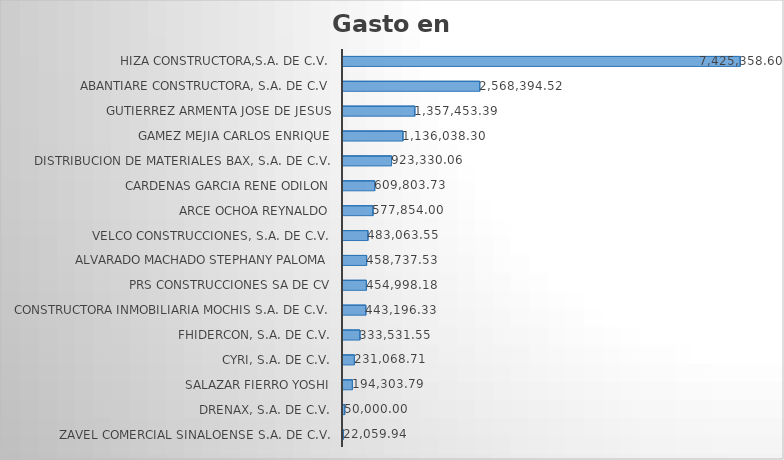
| Category | Suma |
|---|---|
| ZAVEL COMERCIAL SINALOENSE S.A. DE C.V. | 22059.94 |
| DRENAX, S.A. DE C.V. | 50000 |
| SALAZAR FIERRO YOSHI | 194303.79 |
| CYRI, S.A. DE C.V. | 231068.71 |
| FHIDERCON, S.A. DE C.V. | 333531.55 |
| CONSTRUCTORA INMOBILIARIA MOCHIS S.A. DE C.V. | 443196.33 |
| PRS CONSTRUCCIONES SA DE CV | 454998.18 |
| ALVARADO MACHADO STEPHANY PALOMA | 458737.53 |
| VELCO CONSTRUCCIONES, S.A. DE C.V. | 483063.55 |
| ARCE OCHOA REYNALDO | 577854 |
| CARDENAS GARCIA RENE ODILON | 609803.73 |
| DISTRIBUCION DE MATERIALES BAX, S.A. DE C.V. | 923330.06 |
| GAMEZ MEJIA CARLOS ENRIQUE | 1136038.3 |
| GUTIERREZ ARMENTA JOSE DE JESUS | 1357453.39 |
| ABANTIARE CONSTRUCTORA, S.A. DE C.V | 2568394.52 |
| HIZA CONSTRUCTORA,S.A. DE C.V. | 7425358.6 |